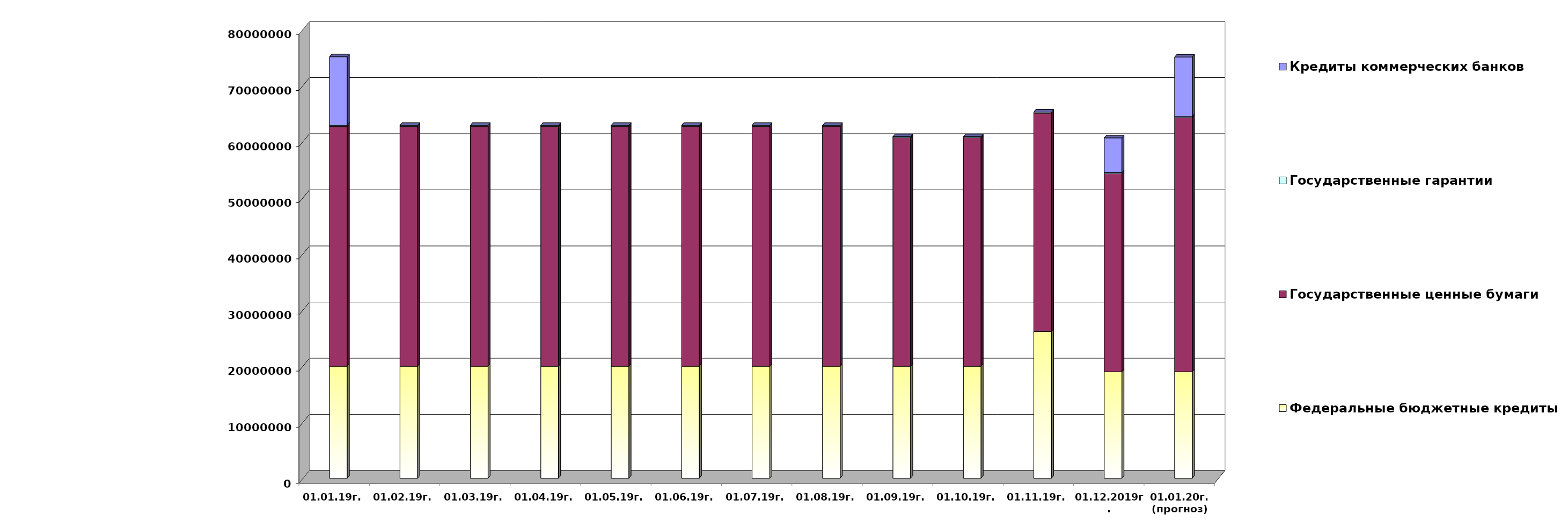
| Category | Федеральные бюджетные кредиты | Государственные ценные бумаги  | Государственные гарантии | Кредиты коммерческих банков |
|---|---|---|---|---|
| 01.01.19г. | 19957026.213 | 42700000 | 209872.86 | 12219963.75 |
| 01.02.19г. | 19957026.213 | 42700000 | 200735.86 | 0 |
| 01.03.19г. | 19957026.213 | 42700000 | 200735.86 | 0 |
| 01.04.19г. | 19957026.213 | 42700000 | 200735.86 | 0 |
| 01.05.19г. | 19957026.213 | 42700000 | 200735.86 | 0 |
| 01.06.19г. | 19957026.213 | 42700000 | 200735.86 | 0 |
| 01.07.19г. | 19957026.213 | 42700000 | 200735.86 | 0 |
| 01.08.19г. | 19957026.213 | 42700000 | 187793.375 | 0 |
| 01.09.19г. | 19957026.213 | 40700000 | 187793.375 | 0 |
| 01.10.19г. | 19957026.213 | 40700000 | 187793.375 | 0 |
| 01.11.19г. | 26148203.213 | 38900000 | 186330.02 | 0 |
| 01.12.2019г. | 18954967.463 | 35300000 | 186330.02 | 6191177 |
| 01.01.20г.
(прогноз) | 18954967.4 | 45300000 | 176330 | 10616393.4 |